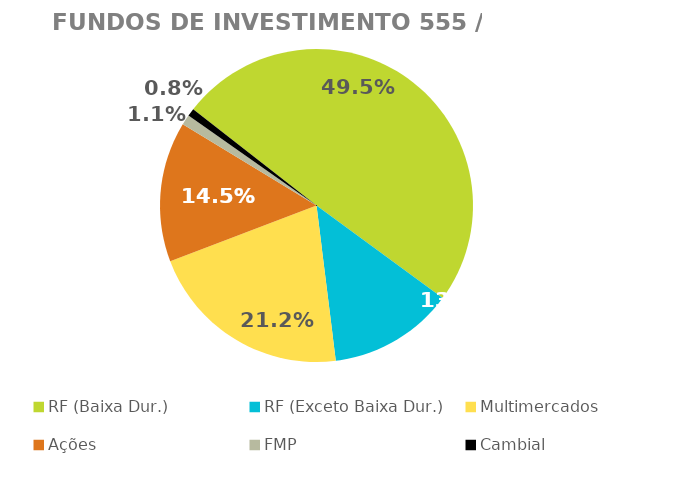
| Category | Fundos de Investimento 555 / FMP |
|---|---|
| RF (Baixa Dur.) | 0.495 |
| RF (Exceto Baixa Dur.) | 0.13 |
| Multimercados | 0.212 |
| Ações | 0.145 |
| FMP | 0.011 |
| Cambial | 0.008 |